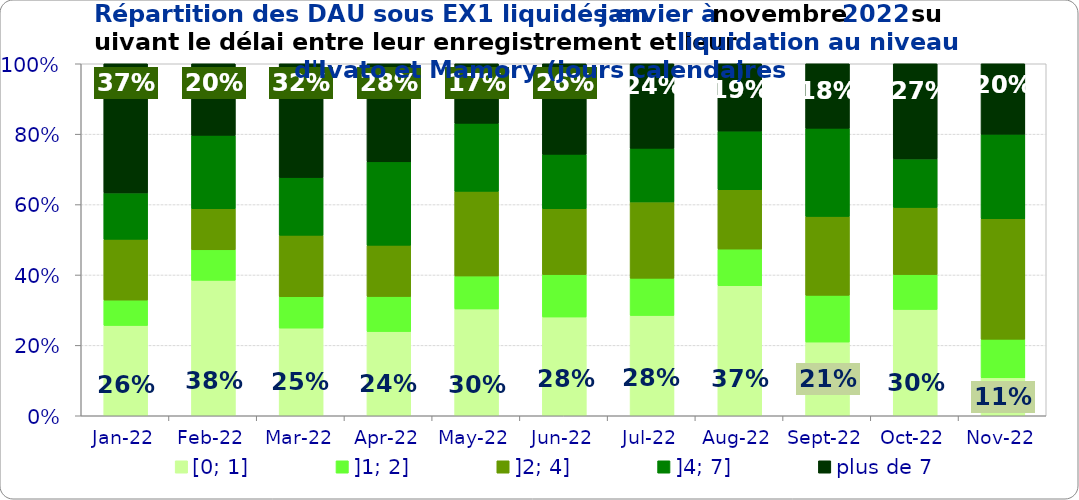
| Category | [0; 1] | ]1; 2] | ]2; 4] | ]4; 7] | plus de 7 |
|---|---|---|---|---|---|
| 2022-01-01 | 0.257 | 0.072 | 0.173 | 0.132 | 0.367 |
| 2022-02-01 | 0.385 | 0.087 | 0.117 | 0.208 | 0.203 |
| 2022-03-01 | 0.249 | 0.089 | 0.174 | 0.164 | 0.323 |
| 2022-04-01 | 0.239 | 0.1 | 0.146 | 0.237 | 0.279 |
| 2022-05-01 | 0.303 | 0.094 | 0.24 | 0.193 | 0.169 |
| 2022-06-01 | 0.281 | 0.121 | 0.187 | 0.155 | 0.257 |
| 2022-07-01 | 0.285 | 0.106 | 0.217 | 0.152 | 0.24 |
| 2022-08-01 | 0.369 | 0.104 | 0.169 | 0.167 | 0.191 |
| 2022-09-01 | 0.209 | 0.133 | 0.224 | 0.25 | 0.183 |
| 2022-10-01 | 0.302 | 0.099 | 0.191 | 0.138 | 0.27 |
| 2022-11-01 | 0.108 | 0.11 | 0.343 | 0.24 | 0.2 |